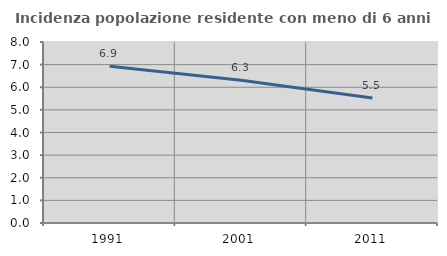
| Category | Incidenza popolazione residente con meno di 6 anni |
|---|---|
| 1991.0 | 6.926 |
| 2001.0 | 6.314 |
| 2011.0 | 5.523 |